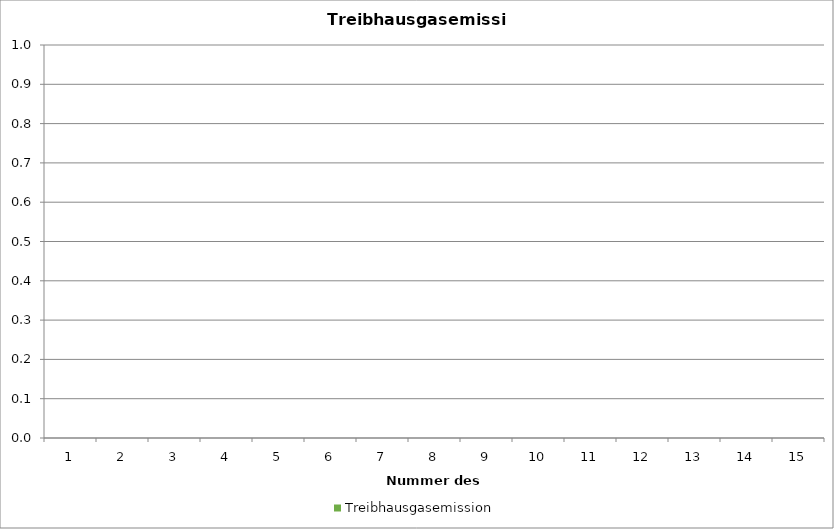
| Category | Treibhausgasemission |
|---|---|
| 0 | 0 |
| 1 | 0 |
| 2 | 0 |
| 3 | 0 |
| 4 | 0 |
| 5 | 0 |
| 6 | 0 |
| 7 | 0 |
| 8 | 0 |
| 9 | 0 |
| 10 | 0 |
| 11 | 0 |
| 12 | 0 |
| 13 | 0 |
| 14 | 0 |